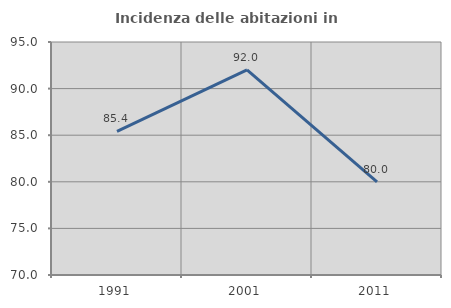
| Category | Incidenza delle abitazioni in proprietà  |
|---|---|
| 1991.0 | 85.417 |
| 2001.0 | 92 |
| 2011.0 | 80 |